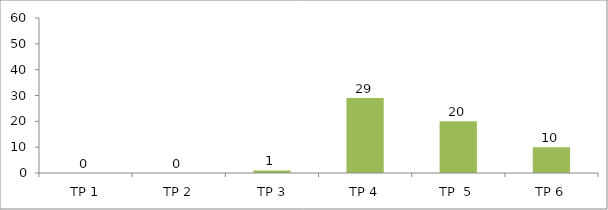
| Category | BIL. MURID |
|---|---|
| TP 1 | 0 |
| TP 2 | 0 |
|  TP 3 | 1 |
| TP 4 | 29 |
| TP  5 | 20 |
| TP 6 | 10 |